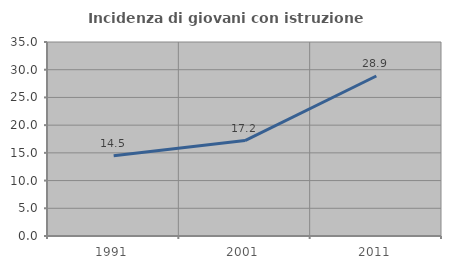
| Category | Incidenza di giovani con istruzione universitaria |
|---|---|
| 1991.0 | 14.493 |
| 2001.0 | 17.211 |
| 2011.0 | 28.871 |